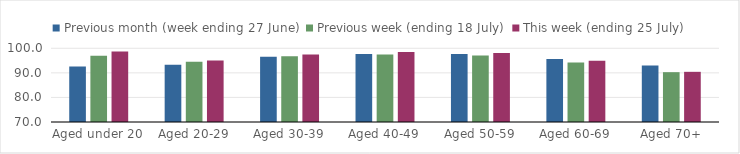
| Category | Previous month (week ending 27 June) | Previous week (ending 18 July) | This week (ending 25 July) |
|---|---|---|---|
| Aged under 20 | 92.593 | 96.93 | 98.729 |
| Aged 20-29 | 93.285 | 94.496 | 95.057 |
| Aged 30-39 | 96.594 | 96.786 | 97.47 |
| Aged 40-49 | 97.646 | 97.457 | 98.445 |
| Aged 50-59 | 97.658 | 97.06 | 98.065 |
| Aged 60-69 | 95.655 | 94.181 | 94.94 |
| Aged 70+ | 93.016 | 90.28 | 90.419 |